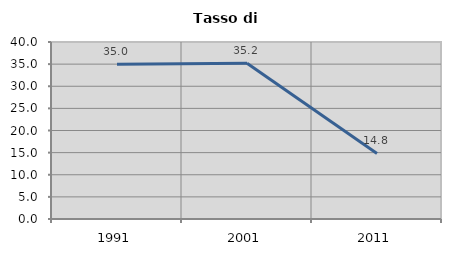
| Category | Tasso di disoccupazione   |
|---|---|
| 1991.0 | 34.981 |
| 2001.0 | 35.217 |
| 2011.0 | 14.815 |